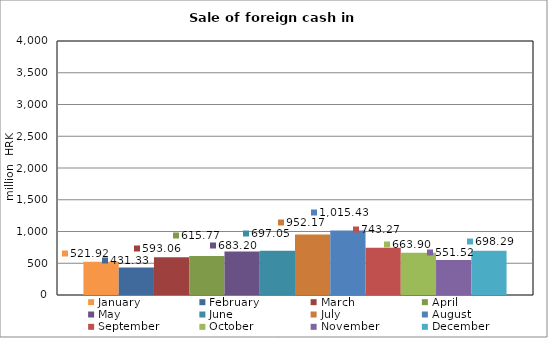
| Category | January | February | March | April | May | June | July | August | September | October | November | December |
|---|---|---|---|---|---|---|---|---|---|---|---|---|
| 0 | 521.918 | 431.331 | 593.064 | 615.774 | 683.195 | 697.053 | 952.169 | 1015.432 | 743.27 | 663.903 | 551.517 | 698.29 |